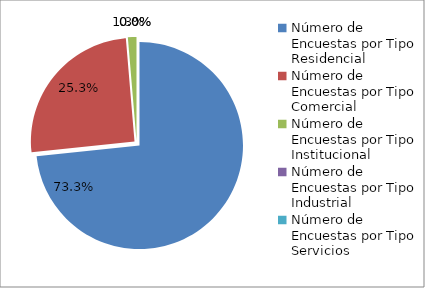
| Category | Series 0 |
|---|---|
| 0 | 165 |
| 1 | 57 |
| 2 | 3 |
| 3 | 0 |
| 4 | 0 |